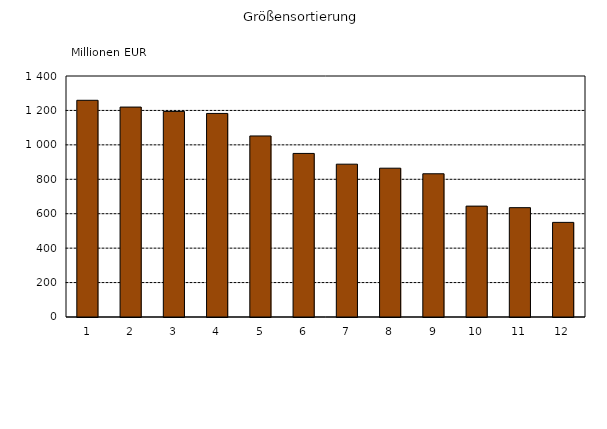
| Category | Series 0 |
|---|---|
| 1 | 1258.881 |
| 2 | 1219.522 |
| 3 | 1194.22 |
| 4 | 1182.543 |
| 5 | 1051.646 |
| 6 | 950.215 |
| 7 | 887.737 |
| 8 | 864.435 |
| 9 | 832.023 |
| 10 | 644.14 |
| 11 | 635.169 |
| 12 | 549.665 |